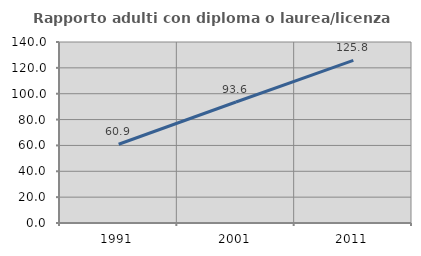
| Category | Rapporto adulti con diploma o laurea/licenza media  |
|---|---|
| 1991.0 | 60.91 |
| 2001.0 | 93.597 |
| 2011.0 | 125.787 |